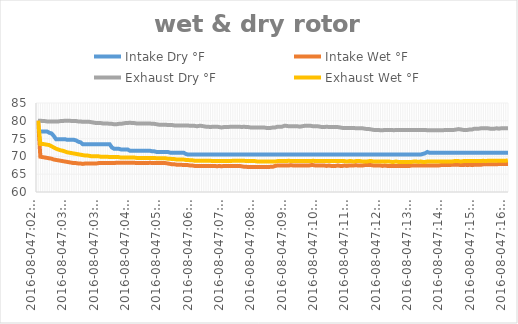
| Category | Intake Dry °F | Intake Wet °F | Exhaust Dry °F | Exhaust Wet °F |
|---|---|---|---|---|
| 2016-08-047:02:03 PM | 77 | 80.038 | 80.038 | 80.038 |
| 2016-08-047:02:07 PM | 77 | 69.912 | 80.038 | 73.512 |
| 2016-08-047:02:11 PM | 77 | 69.8 | 79.925 | 73.512 |
| 2016-08-047:02:15 PM | 77 | 69.688 | 79.925 | 73.4 |
| 2016-08-047:02:20 PM | 77 | 69.575 | 79.812 | 73.288 |
| 2016-08-047:02:24 PM | 76.64 | 69.462 | 79.812 | 73.175 |
| 2016-08-047:02:28 PM | 76.46 | 69.35 | 79.812 | 72.838 |
| 2016-08-047:02:32 PM | 75.74 | 69.125 | 79.812 | 72.5 |
| 2016-08-047:02:36 PM | 74.84 | 69.012 | 79.812 | 72.162 |
| 2016-08-047:02:40 PM | 74.84 | 68.9 | 79.812 | 71.938 |
| 2016-08-047:02:44 PM | 74.84 | 68.788 | 79.925 | 71.712 |
| 2016-08-047:02:49 PM | 74.84 | 68.675 | 79.925 | 71.6 |
| 2016-08-047:02:53 PM | 74.84 | 68.562 | 80.038 | 71.375 |
| 2016-08-047:02:57 PM | 74.66 | 68.45 | 80.038 | 71.15 |
| 2016-08-047:03:01 PM | 74.66 | 68.338 | 80.038 | 71.038 |
| 2016-08-047:03:05 PM | 74.66 | 68.225 | 79.925 | 70.925 |
| 2016-08-047:03:09 PM | 74.66 | 68.112 | 79.925 | 70.812 |
| 2016-08-047:03:13 PM | 74.48 | 68.112 | 79.925 | 70.7 |
| 2016-08-047:03:18 PM | 74.12 | 68 | 79.812 | 70.588 |
| 2016-08-047:03:22 PM | 73.94 | 68 | 79.812 | 70.475 |
| 2016-08-047:03:26 PM | 73.4 | 67.888 | 79.7 | 70.362 |
| 2016-08-047:03:30 PM | 73.4 | 68 | 79.7 | 70.25 |
| 2016-08-047:03:34 PM | 73.4 | 68 | 79.7 | 70.25 |
| 2016-08-047:03:38 PM | 73.4 | 68 | 79.7 | 70.138 |
| 2016-08-047:03:42 PM | 73.4 | 68 | 79.588 | 70.025 |
| 2016-08-047:03:46 PM | 73.4 | 68 | 79.475 | 70.025 |
| 2016-08-047:03:50 PM | 73.4 | 68 | 79.362 | 70.025 |
| 2016-08-047:03:54 PM | 73.4 | 68.112 | 79.362 | 70.025 |
| 2016-08-047:03:58 PM | 73.4 | 68.112 | 79.362 | 69.912 |
| 2016-08-047:04:02 PM | 73.4 | 68.112 | 79.25 | 69.912 |
| 2016-08-047:04:07 PM | 73.4 | 68.112 | 79.25 | 69.912 |
| 2016-08-047:04:11 PM | 73.4 | 68.112 | 79.25 | 69.912 |
| 2016-08-047:04:15 PM | 73.4 | 68.112 | 79.138 | 69.8 |
| 2016-08-047:04:19 PM | 72.5 | 68.112 | 79.138 | 69.8 |
| 2016-08-047:04:23 PM | 72.14 | 68.112 | 79.025 | 69.8 |
| 2016-08-047:04:27 PM | 72.14 | 68.225 | 79.025 | 69.8 |
| 2016-08-047:04:31 PM | 72.14 | 68.225 | 79.138 | 69.8 |
| 2016-08-047:04:35 PM | 71.96 | 68.225 | 79.138 | 69.688 |
| 2016-08-047:04:39 PM | 71.96 | 68.225 | 79.25 | 69.688 |
| 2016-08-047:04:43 PM | 71.96 | 68.225 | 79.362 | 69.688 |
| 2016-08-047:04:47 PM | 71.96 | 68.225 | 79.362 | 69.688 |
| 2016-08-047:04:51 PM | 71.6 | 68.225 | 79.475 | 69.688 |
| 2016-08-047:04:55 PM | 71.6 | 68.225 | 79.362 | 69.688 |
| 2016-08-047:04:59 PM | 71.6 | 68.225 | 79.362 | 69.688 |
| 2016-08-047:05:03 PM | 71.6 | 68.112 | 79.25 | 69.575 |
| 2016-08-047:05:07 PM | 71.6 | 68.112 | 79.25 | 69.575 |
| 2016-08-047:05:11 PM | 71.6 | 68.112 | 79.25 | 69.575 |
| 2016-08-047:05:15 PM | 71.6 | 68.112 | 79.25 | 69.575 |
| 2016-08-047:05:19 PM | 71.6 | 68.112 | 79.25 | 69.575 |
| 2016-08-047:05:24 PM | 71.6 | 68.112 | 79.25 | 69.575 |
| 2016-08-047:05:28 PM | 71.6 | 68.225 | 79.25 | 69.575 |
| 2016-08-047:05:32 PM | 71.42 | 68.112 | 79.138 | 69.575 |
| 2016-08-047:05:36 PM | 71.42 | 68.112 | 79.138 | 69.575 |
| 2016-08-047:05:40 PM | 71.24 | 68.112 | 79.025 | 69.462 |
| 2016-08-047:05:44 PM | 71.24 | 68.112 | 78.912 | 69.462 |
| 2016-08-047:05:48 PM | 71.24 | 68.112 | 78.912 | 69.462 |
| 2016-08-047:05:52 PM | 71.24 | 68.112 | 78.912 | 69.462 |
| 2016-08-047:05:56 PM | 71.24 | 68.112 | 78.912 | 69.462 |
| 2016-08-047:06:00 PM | 71.24 | 68 | 78.8 | 69.35 |
| 2016-08-047:06:04 PM | 71.06 | 67.888 | 78.8 | 69.35 |
| 2016-08-047:06:08 PM | 71.06 | 67.775 | 78.8 | 69.238 |
| 2016-08-047:06:12 PM | 71.06 | 67.775 | 78.688 | 69.238 |
| 2016-08-047:06:16 PM | 71.06 | 67.662 | 78.688 | 69.125 |
| 2016-08-047:06:20 PM | 71.06 | 67.662 | 78.688 | 69.125 |
| 2016-08-047:06:24 PM | 71.06 | 67.662 | 78.688 | 69.125 |
| 2016-08-047:06:29 PM | 71.06 | 67.55 | 78.688 | 69.125 |
| 2016-08-047:06:33 PM | 70.7 | 67.55 | 78.688 | 69.012 |
| 2016-08-047:06:37 PM | 70.52 | 67.55 | 78.688 | 69.012 |
| 2016-08-047:06:41 PM | 70.52 | 67.438 | 78.575 | 68.9 |
| 2016-08-047:06:45 PM | 70.52 | 67.438 | 78.575 | 68.9 |
| 2016-08-047:06:49 PM | 70.52 | 67.325 | 78.575 | 68.788 |
| 2016-08-047:06:53 PM | 70.52 | 67.325 | 78.462 | 68.788 |
| 2016-08-047:06:57 PM | 70.52 | 67.325 | 78.575 | 68.788 |
| 2016-08-047:07:01 PM | 70.52 | 67.325 | 78.575 | 68.788 |
| 2016-08-047:07:05 PM | 70.52 | 67.325 | 78.462 | 68.788 |
| 2016-08-047:07:09 PM | 70.52 | 67.325 | 78.35 | 68.788 |
| 2016-08-047:07:13 PM | 70.52 | 67.325 | 78.35 | 68.788 |
| 2016-08-047:07:17 PM | 70.52 | 67.325 | 78.238 | 68.788 |
| 2016-08-047:07:21 PM | 70.52 | 67.325 | 78.35 | 68.675 |
| 2016-08-047:07:25 PM | 70.52 | 67.325 | 78.35 | 68.675 |
| 2016-08-047:07:30 PM | 70.52 | 67.212 | 78.35 | 68.675 |
| 2016-08-047:07:34 PM | 70.52 | 67.325 | 78.238 | 68.675 |
| 2016-08-047:07:38 PM | 70.52 | 67.212 | 78.125 | 68.675 |
| 2016-08-047:07:42 PM | 70.52 | 67.325 | 78.238 | 68.675 |
| 2016-08-047:07:46 PM | 70.52 | 67.325 | 78.238 | 68.675 |
| 2016-08-047:07:50 PM | 70.52 | 67.325 | 78.238 | 68.675 |
| 2016-08-047:07:54 PM | 70.52 | 67.325 | 78.35 | 68.675 |
| 2016-08-047:07:58 PM | 70.52 | 67.325 | 78.35 | 68.788 |
| 2016-08-047:08:02 PM | 70.52 | 67.325 | 78.35 | 68.788 |
| 2016-08-047:08:06 PM | 70.52 | 67.325 | 78.35 | 68.788 |
| 2016-08-047:08:10 PM | 70.52 | 67.325 | 78.35 | 68.788 |
| 2016-08-047:08:14 PM | 70.52 | 67.212 | 78.238 | 68.788 |
| 2016-08-047:08:18 PM | 70.52 | 67.1 | 78.35 | 68.788 |
| 2016-08-047:08:23 PM | 70.52 | 67.1 | 78.238 | 68.675 |
| 2016-08-047:08:27 PM | 70.52 | 66.988 | 78.238 | 68.675 |
| 2016-08-047:08:31 PM | 70.52 | 66.988 | 78.125 | 68.675 |
| 2016-08-047:08:35 PM | 70.52 | 66.988 | 78.125 | 68.675 |
| 2016-08-047:08:39 PM | 70.52 | 66.988 | 78.125 | 68.675 |
| 2016-08-047:08:43 PM | 70.52 | 66.988 | 78.125 | 68.562 |
| 2016-08-047:08:47 PM | 70.52 | 66.988 | 78.125 | 68.562 |
| 2016-08-047:08:51 PM | 70.52 | 66.988 | 78.125 | 68.562 |
| 2016-08-047:08:55 PM | 70.52 | 66.988 | 78.125 | 68.562 |
| 2016-08-047:09:00 PM | 70.52 | 66.988 | 78.012 | 68.562 |
| 2016-08-047:09:04 PM | 70.52 | 66.988 | 78.012 | 68.562 |
| 2016-08-047:09:08 PM | 70.52 | 67.1 | 78.012 | 68.562 |
| 2016-08-047:09:12 PM | 70.52 | 67.1 | 78.125 | 68.562 |
| 2016-08-047:09:16 PM | 70.52 | 67.325 | 78.125 | 68.562 |
| 2016-08-047:09:20 PM | 70.52 | 67.438 | 78.35 | 68.675 |
| 2016-08-047:09:24 PM | 70.52 | 67.438 | 78.35 | 68.675 |
| 2016-08-047:09:28 PM | 70.52 | 67.438 | 78.35 | 68.675 |
| 2016-08-047:09:32 PM | 70.52 | 67.438 | 78.575 | 68.675 |
| 2016-08-047:09:36 PM | 70.52 | 67.438 | 78.575 | 68.675 |
| 2016-08-047:09:40 PM | 70.52 | 67.438 | 78.462 | 68.788 |
| 2016-08-047:09:44 PM | 70.52 | 67.55 | 78.462 | 68.675 |
| 2016-08-047:09:48 PM | 70.52 | 67.438 | 78.462 | 68.675 |
| 2016-08-047:09:53 PM | 70.52 | 67.438 | 78.462 | 68.675 |
| 2016-08-047:09:57 PM | 70.52 | 67.438 | 78.462 | 68.675 |
| 2016-08-047:10:01 PM | 70.52 | 67.438 | 78.35 | 68.675 |
| 2016-08-047:10:05 PM | 70.52 | 67.438 | 78.462 | 68.675 |
| 2016-08-047:10:09 PM | 70.52 | 67.438 | 78.575 | 68.675 |
| 2016-08-047:10:13 PM | 70.52 | 67.438 | 78.575 | 68.675 |
| 2016-08-047:10:17 PM | 70.52 | 67.438 | 78.575 | 68.675 |
| 2016-08-047:10:21 PM | 70.52 | 67.55 | 78.575 | 68.675 |
| 2016-08-047:10:25 PM | 70.52 | 67.55 | 78.462 | 68.788 |
| 2016-08-047:10:29 PM | 70.52 | 67.438 | 78.462 | 68.675 |
| 2016-08-047:10:33 PM | 70.52 | 67.438 | 78.462 | 68.675 |
| 2016-08-047:10:37 PM | 70.52 | 67.438 | 78.35 | 68.675 |
| 2016-08-047:10:41 PM | 70.52 | 67.438 | 78.238 | 68.675 |
| 2016-08-047:10:45 PM | 70.52 | 67.438 | 78.238 | 68.675 |
| 2016-08-047:10:49 PM | 70.52 | 67.325 | 78.35 | 68.675 |
| 2016-08-047:10:53 PM | 70.52 | 67.438 | 78.238 | 68.675 |
| 2016-08-047:10:57 PM | 70.52 | 67.325 | 78.238 | 68.675 |
| 2016-08-047:11:01 PM | 70.52 | 67.325 | 78.238 | 68.675 |
| 2016-08-047:11:05 PM | 70.52 | 67.325 | 78.238 | 68.675 |
| 2016-08-047:11:09 PM | 70.52 | 67.438 | 78.238 | 68.675 |
| 2016-08-047:11:13 PM | 70.52 | 67.325 | 78.125 | 68.675 |
| 2016-08-047:11:18 PM | 70.52 | 67.325 | 78.012 | 68.675 |
| 2016-08-047:11:22 PM | 70.52 | 67.438 | 78.012 | 68.675 |
| 2016-08-047:11:26 PM | 70.52 | 67.325 | 78.012 | 68.562 |
| 2016-08-047:11:30 PM | 70.52 | 67.438 | 78.012 | 68.675 |
| 2016-08-047:11:34 PM | 70.52 | 67.438 | 78.012 | 68.675 |
| 2016-08-047:11:38 PM | 70.52 | 67.438 | 78.012 | 68.562 |
| 2016-08-047:11:42 PM | 70.52 | 67.55 | 77.9 | 68.675 |
| 2016-08-047:11:46 PM | 70.52 | 67.438 | 77.9 | 68.675 |
| 2016-08-047:11:50 PM | 70.52 | 67.438 | 77.9 | 68.675 |
| 2016-08-047:11:54 PM | 70.52 | 67.438 | 77.9 | 68.562 |
| 2016-08-047:11:58 PM | 70.52 | 67.55 | 77.788 | 68.562 |
| 2016-08-047:12:03 PM | 70.52 | 67.55 | 77.675 | 68.562 |
| 2016-08-047:12:07 PM | 70.52 | 67.55 | 77.675 | 68.675 |
| 2016-08-047:12:11 PM | 70.52 | 67.55 | 77.562 | 68.675 |
| 2016-08-047:12:15 PM | 70.52 | 67.438 | 77.45 | 68.562 |
| 2016-08-047:12:19 PM | 70.52 | 67.438 | 77.45 | 68.562 |
| 2016-08-047:12:23 PM | 70.52 | 67.438 | 77.45 | 68.562 |
| 2016-08-047:12:27 PM | 70.52 | 67.438 | 77.338 | 68.562 |
| 2016-08-047:12:31 PM | 70.52 | 67.325 | 77.338 | 68.562 |
| 2016-08-047:12:35 PM | 70.52 | 67.438 | 77.45 | 68.562 |
| 2016-08-047:12:39 PM | 70.52 | 67.325 | 77.45 | 68.562 |
| 2016-08-047:12:43 PM | 70.52 | 67.325 | 77.45 | 68.562 |
| 2016-08-047:12:47 PM | 70.52 | 67.325 | 77.45 | 68.45 |
| 2016-08-047:12:51 PM | 70.52 | 67.325 | 77.338 | 68.45 |
| 2016-08-047:12:55 PM | 70.52 | 67.325 | 77.45 | 68.562 |
| 2016-08-047:13:00 PM | 70.52 | 67.325 | 77.45 | 68.45 |
| 2016-08-047:13:04 PM | 70.52 | 67.325 | 77.45 | 68.45 |
| 2016-08-047:13:08 PM | 70.52 | 67.325 | 77.45 | 68.45 |
| 2016-08-047:13:12 PM | 70.52 | 67.325 | 77.45 | 68.45 |
| 2016-08-047:13:16 PM | 70.52 | 67.325 | 77.45 | 68.45 |
| 2016-08-047:13:20 PM | 70.52 | 67.325 | 77.45 | 68.45 |
| 2016-08-047:13:24 PM | 70.52 | 67.438 | 77.45 | 68.45 |
| 2016-08-047:13:28 PM | 70.52 | 67.438 | 77.45 | 68.562 |
| 2016-08-047:13:32 PM | 70.52 | 67.438 | 77.45 | 68.562 |
| 2016-08-047:13:36 PM | 70.52 | 67.438 | 77.45 | 68.45 |
| 2016-08-047:13:40 PM | 70.52 | 67.438 | 77.45 | 68.562 |
| 2016-08-047:13:44 PM | 70.7 | 67.438 | 77.45 | 68.45 |
| 2016-08-047:13:48 PM | 70.88 | 67.438 | 77.45 | 68.45 |
| 2016-08-047:13:52 PM | 71.24 | 67.438 | 77.338 | 68.562 |
| 2016-08-047:13:56 PM | 71 | 67.438 | 77.338 | 68.562 |
| 2016-08-047:14:00 PM | 71 | 67.438 | 77.338 | 68.562 |
| 2016-08-047:14:05 PM | 71 | 67.438 | 77.338 | 68.562 |
| 2016-08-047:14:09 PM | 71 | 67.438 | 77.338 | 68.562 |
| 2016-08-047:14:13 PM | 71 | 67.438 | 77.338 | 68.562 |
| 2016-08-047:14:17 PM | 71 | 67.55 | 77.338 | 68.562 |
| 2016-08-047:14:21 PM | 71 | 67.55 | 77.338 | 68.562 |
| 2016-08-047:14:25 PM | 71 | 67.55 | 77.45 | 68.562 |
| 2016-08-047:14:29 PM | 71 | 67.55 | 77.45 | 68.562 |
| 2016-08-047:14:33 PM | 71 | 67.55 | 77.45 | 68.562 |
| 2016-08-047:14:37 PM | 71 | 67.662 | 77.45 | 68.562 |
| 2016-08-047:14:41 PM | 71 | 67.662 | 77.45 | 68.675 |
| 2016-08-047:14:45 PM | 71 | 67.662 | 77.562 | 68.675 |
| 2016-08-047:14:49 PM | 71 | 67.662 | 77.675 | 68.675 |
| 2016-08-047:14:53 PM | 71 | 67.55 | 77.562 | 68.562 |
| 2016-08-047:14:58 PM | 71 | 67.55 | 77.45 | 68.675 |
| 2016-08-047:15:02 PM | 71 | 67.662 | 77.45 | 68.675 |
| 2016-08-047:15:06 PM | 71 | 67.55 | 77.45 | 68.675 |
| 2016-08-047:15:10 PM | 71 | 67.662 | 77.562 | 68.675 |
| 2016-08-047:15:14 PM | 71 | 67.55 | 77.562 | 68.675 |
| 2016-08-047:15:18 PM | 71 | 67.662 | 77.788 | 68.675 |
| 2016-08-047:15:22 PM | 71 | 67.662 | 77.788 | 68.675 |
| 2016-08-047:15:26 PM | 71 | 67.662 | 77.788 | 68.675 |
| 2016-08-047:15:30 PM | 71 | 67.662 | 77.9 | 68.675 |
| 2016-08-047:15:34 PM | 71 | 67.775 | 77.9 | 68.788 |
| 2016-08-047:15:38 PM | 71 | 67.775 | 77.9 | 68.675 |
| 2016-08-047:15:42 PM | 71 | 67.775 | 77.9 | 68.788 |
| 2016-08-047:15:46 PM | 71 | 67.775 | 77.788 | 68.788 |
| 2016-08-047:15:50 PM | 71 | 67.775 | 77.788 | 68.788 |
| 2016-08-047:15:54 PM | 71 | 67.775 | 77.788 | 68.788 |
| 2016-08-047:15:58 PM | 71 | 67.775 | 77.9 | 68.788 |
| 2016-08-047:16:03 PM | 71 | 67.888 | 77.788 | 68.788 |
| 2016-08-047:16:07 PM | 71 | 67.888 | 77.9 | 68.788 |
| 2016-08-047:16:11 PM | 71 | 67.888 | 77.9 | 68.788 |
| 2016-08-047:16:15 PM | 71 | 67.888 | 77.9 | 68.788 |
| 2016-08-047:16:19 PM | 71 | 67.888 | 77.9 | 68.9 |